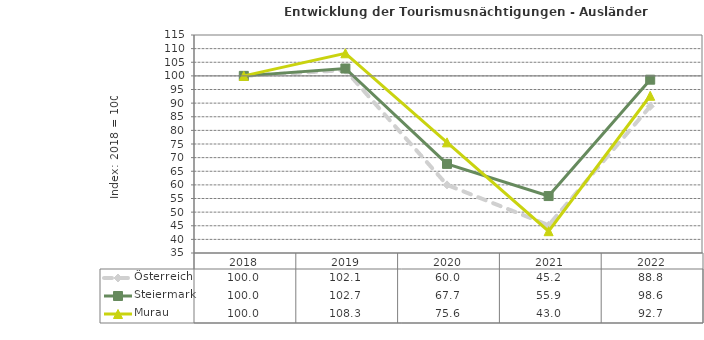
| Category | Österreich | Steiermark | Murau |
|---|---|---|---|
| 2022.0 | 88.8 | 98.6 | 92.7 |
| 2021.0 | 45.2 | 55.9 | 43 |
| 2020.0 | 60 | 67.7 | 75.6 |
| 2019.0 | 102.1 | 102.7 | 108.3 |
| 2018.0 | 100 | 100 | 100 |